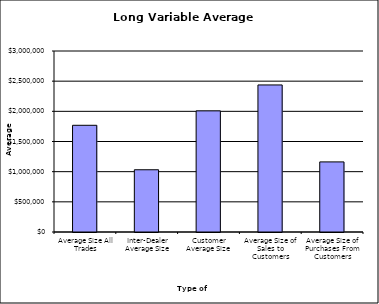
| Category | Security Type |
|---|---|
| Average Size All Trades | 1768739.374 |
| Inter-Dealer Average Size | 1031747.312 |
| Customer Average Size | 2008076.822 |
| Average Size of Sales to Customers | 2437251.316 |
| Average Size of Purchases From Customers | 1161974.06 |